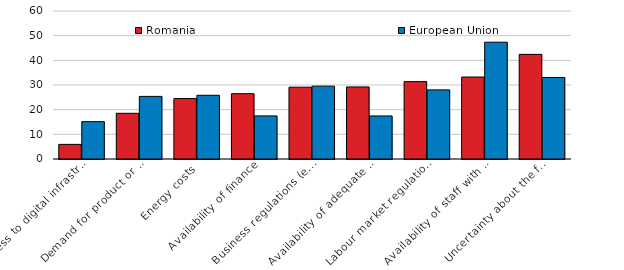
| Category | Romania | European Union |
|---|---|---|
| Access to digital infrastructure | 5.926 | 15.143 |
| Demand for product or service | 18.527 | 25.381 |
| Energy costs | 24.497 | 25.826 |
| Availability of finance | 26.484 | 17.469 |
| Business regulations (e.g. licences, permits) and taxation | 29.118 | 29.528 |
| Availability of adequate transport infrastructure | 29.214 | 17.458 |
| Labour market regulations | 31.372 | 28.02 |
| Availability of staff with the right skills | 33.234 | 47.353 |
| Uncertainty about the future | 42.42 | 33.051 |